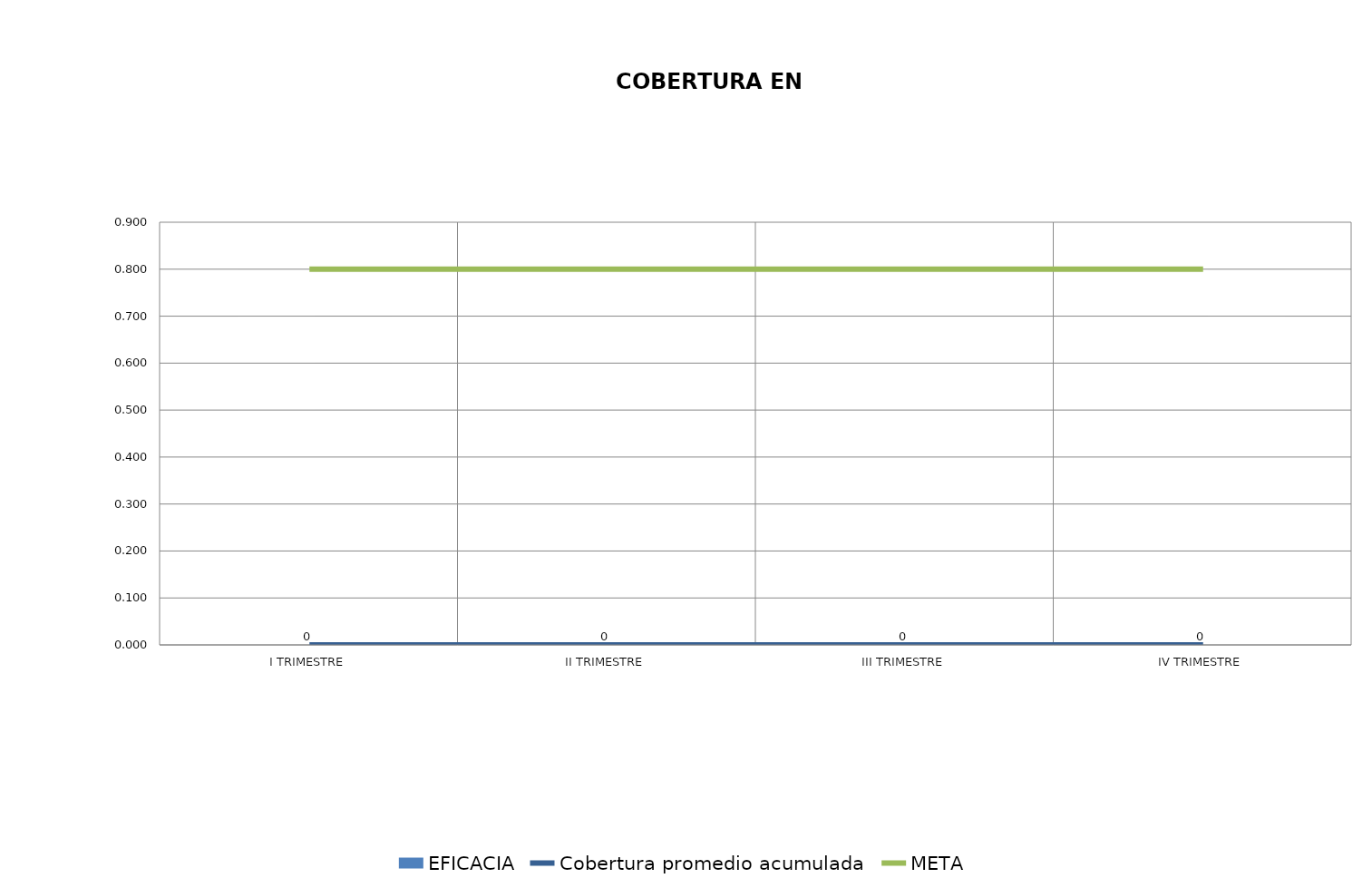
| Category | EFICACIA |
|---|---|
| I TRIMESTRE | 0 |
| II TRIMESTRE | 0 |
| III TRIMESTRE | 0 |
| IV TRIMESTRE | 0 |